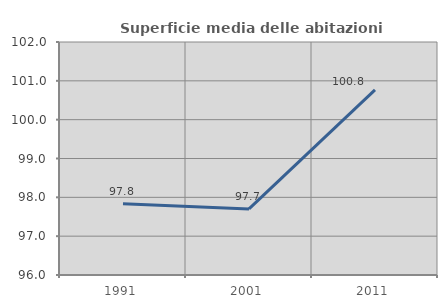
| Category | Superficie media delle abitazioni occupate |
|---|---|
| 1991.0 | 97.833 |
| 2001.0 | 97.701 |
| 2011.0 | 100.767 |